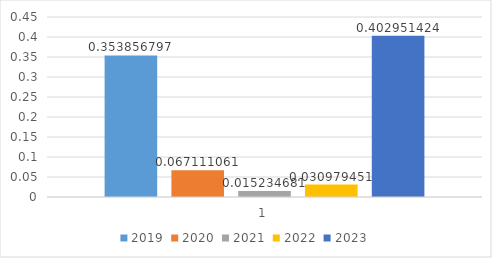
| Category | 2019 | 2020 | 2021 | 2022 | 2023 |
|---|---|---|---|---|---|
| 0 | 0.354 | 0.067 | 0.015 | 0.031 | 0.403 |